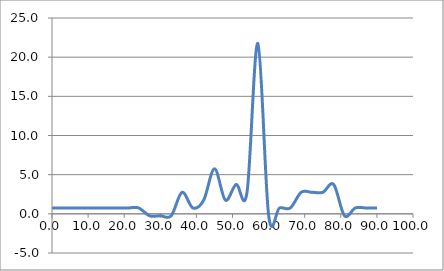
| Category | Elevation (in.) |
|---|---|
| 0.024 | 0.75 |
| 3.024 | 0.75 |
| 6.024 | 0.75 |
| 9.024000000000001 | 0.75 |
| 12.024000000000001 | 0.75 |
| 15.024000000000001 | 0.75 |
| 18.024 | 0.75 |
| 21.024 | 0.75 |
| 24.023999999999997 | 0.75 |
| 27.023999999999997 | -0.25 |
| 30.023999999999997 | -0.25 |
| 33.024 | -0.25 |
| 36.024 | 2.75 |
| 39.024 | 0.75 |
| 42.024 | 1.75 |
| 45.024 | 5.75 |
| 48.024 | 1.75 |
| 51.024 | 3.75 |
| 54.024 | 2.75 |
| 57.024 | 21.75 |
| 60.024 | -0.25 |
| 63.024 | 0.75 |
| 66.024 | 0.75 |
| 69.024 | 2.75 |
| 72.024 | 2.75 |
| 75.024 | 2.75 |
| 78.024 | 3.75 |
| 81.024 | -0.25 |
| 84.024 | 0.75 |
| 87.024 | 0.75 |
| 90.024 | 0.75 |